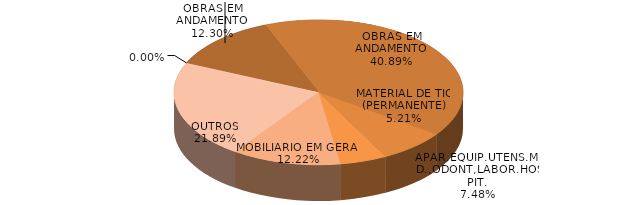
| Category | Series 0 | Series 1 |
|---|---|---|
| OBRAS EM ANDAMENTO | 500026.32 | 0.123 |
| OBRAS EM ANDAMENTO | 1662098.36 | 0.409 |
| APAR.EQUIP.UTENS.MED.,ODONT,LABOR.HOSPIT. | 304228.58 | 0.075 |
| MATERIAL DE TIC (PERMANENTE) | 211833.96 | 0.052 |
| MOBILIARIO EM GERAL | 496615.77 | 0.122 |
| OUTROS | 889881.46 | 0.219 |